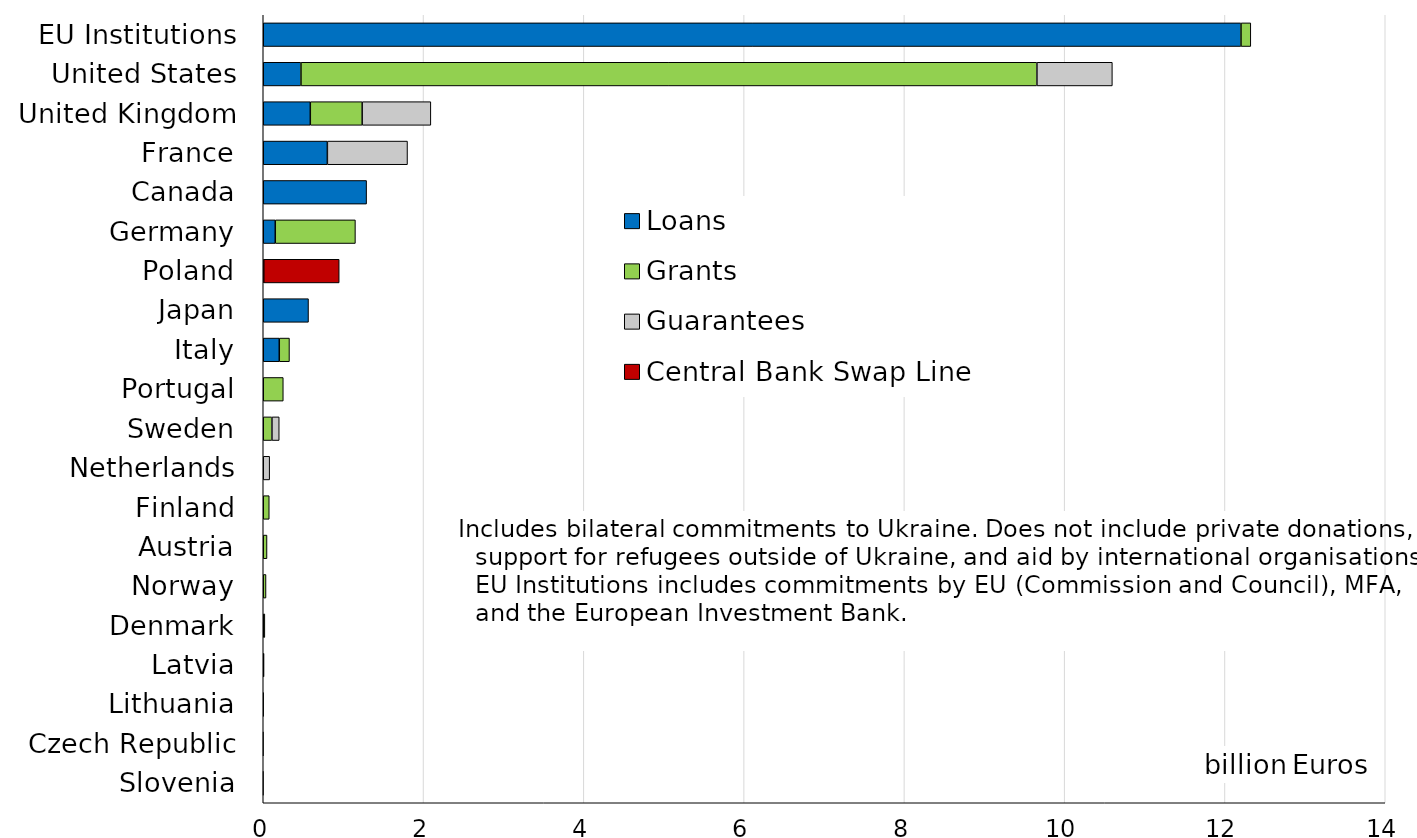
| Category | Loans | Grants | Guarantees | Central Bank Swap Line |
|---|---|---|---|---|
| EU Institutions | 12.2 | 0.122 | 0 | 0 |
| United States | 0.471 | 9.183 | 0.941 | 0 |
| United Kingdom | 0.587 | 0.647 | 0.857 | 0 |
| France | 0.8 | 0 | 1 | 0 |
| Canada | 1.29 | 0 | 0 | 0 |
| Germany | 0.15 | 1 | 0 | 0 |
| Poland | 0 | 0.006 | 0 | 0.941 |
| Japan | 0.565 | 0 | 0 | 0 |
| Italy | 0.2 | 0.127 | 0 | 0 |
| Portugal | 0 | 0.25 | 0 | 0 |
| Sweden | 0 | 0.108 | 0.091 | 0 |
| Netherlands | 0 | 0 | 0.08 | 0 |
| Finland | 0 | 0.075 | 0 | 0 |
| Austria | 0 | 0.047 | 0 | 0 |
| Norway | 0 | 0.034 | 0 | 0 |
| Denmark | 0 | 0.02 | 0 | 0 |
| Latvia | 0 | 0.01 | 0 | 0 |
| Lithuania | 0 | 0.005 | 0 | 0 |
| Czech Republic | 0 | 0 | 0 | 0 |
| Slovenia | 0 | 0 | 0 | 0 |